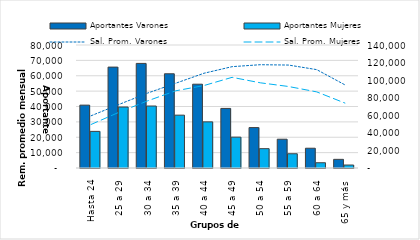
| Category | Aportantes Varones | Aportantes Mujeres |
|---|---|---|
| Hasta 24 | 71563 | 41687 |
| 25 a 29 | 114849 | 69402 |
| 30 a 34 | 119044 | 70547 |
| 35 a 39 | 107253 | 60158 |
| 40 a 44 | 95388 | 52527 |
| 45 a 49 | 67800 | 35131 |
| 50 a 54 | 46007 | 22007 |
| 55 a 59 | 32767 | 16219 |
| 60 a 64 | 22507 | 5981 |
| 65 y más | 9850 | 3386 |